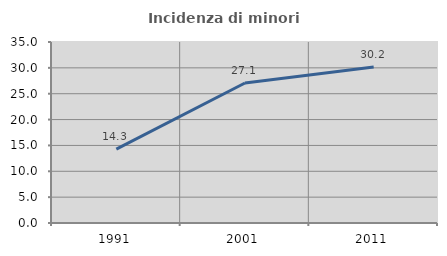
| Category | Incidenza di minori stranieri |
|---|---|
| 1991.0 | 14.286 |
| 2001.0 | 27.068 |
| 2011.0 | 30.162 |